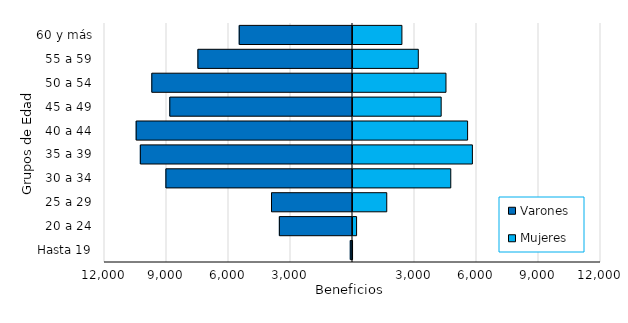
| Category | Varones | Mujeres |
|---|---|---|
| Hasta 19 | -107 | 27 |
| 20 a 24 | -3539 | 222 |
| 25 a 29 | -3919 | 1682 |
| 30 a 34 | -9028 | 4779 |
| 35 a 39 | -10266 | 5826 |
| 40 a 44 | -10467 | 5594 |
| 45 a 49 | -8840 | 4315 |
| 50 a 54 | -9710 | 4547 |
| 55 a 59 | -7480 | 3208 |
| 60 y más | -5481 | 2415 |